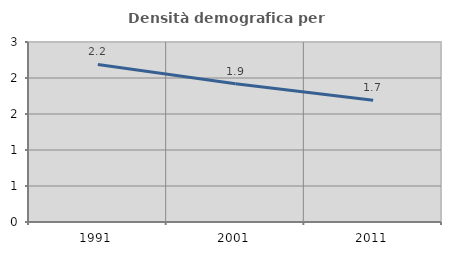
| Category | Densità demografica |
|---|---|
| 1991.0 | 2.188 |
| 2001.0 | 1.92 |
| 2011.0 | 1.693 |